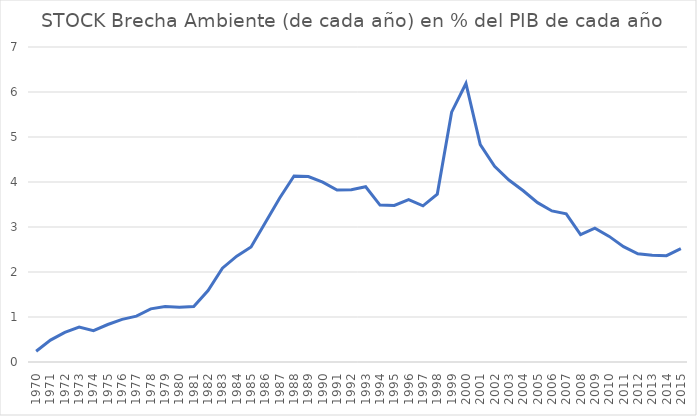
| Category | STOCK Brecha Ambiente (de cada año) en % del PIB |
|---|---|
| 1970.0 | 0.238 |
| 1971.0 | 0.486 |
| 1972.0 | 0.658 |
| 1973.0 | 0.777 |
| 1974.0 | 0.697 |
| 1975.0 | 0.833 |
| 1976.0 | 0.947 |
| 1977.0 | 1.019 |
| 1978.0 | 1.181 |
| 1979.0 | 1.231 |
| 1980.0 | 1.214 |
| 1981.0 | 1.234 |
| 1982.0 | 1.589 |
| 1983.0 | 2.084 |
| 1984.0 | 2.352 |
| 1985.0 | 2.558 |
| 1986.0 | 3.103 |
| 1987.0 | 3.645 |
| 1988.0 | 4.133 |
| 1989.0 | 4.122 |
| 1990.0 | 3.995 |
| 1991.0 | 3.822 |
| 1992.0 | 3.827 |
| 1993.0 | 3.895 |
| 1994.0 | 3.486 |
| 1995.0 | 3.479 |
| 1996.0 | 3.608 |
| 1997.0 | 3.47 |
| 1998.0 | 3.73 |
| 1999.0 | 5.552 |
| 2000.0 | 6.189 |
| 2001.0 | 4.833 |
| 2002.0 | 4.348 |
| 2003.0 | 4.044 |
| 2004.0 | 3.806 |
| 2005.0 | 3.541 |
| 2006.0 | 3.357 |
| 2007.0 | 3.293 |
| 2008.0 | 2.832 |
| 2009.0 | 2.975 |
| 2010.0 | 2.791 |
| 2011.0 | 2.564 |
| 2012.0 | 2.404 |
| 2013.0 | 2.37 |
| 2014.0 | 2.363 |
| 2015.0 | 2.517 |